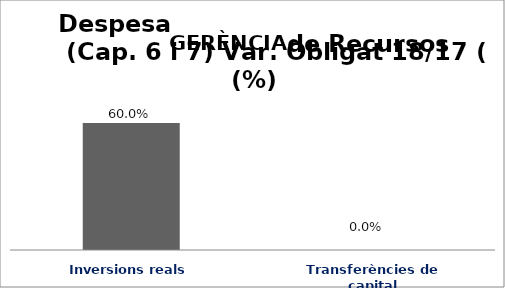
| Category | Series 0 |
|---|---|
| Inversions reals | 0.6 |
| Transferències de capital | 0 |